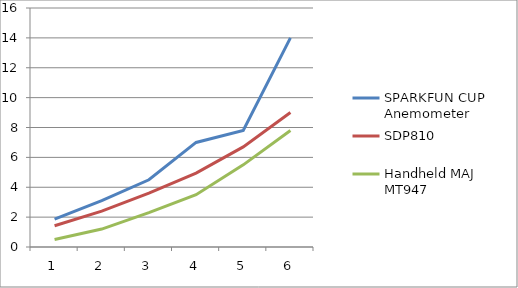
| Category | SPARKFUN CUP Anemometer | SDP810 | Handheld MAJ MT947 |
|---|---|---|---|
| 1.0 | 1.86 | 1.42 | 0.5 |
| 2.0 | 3.1 | 2.4 | 1.2 |
| 3.0 | 4.5 | 3.6 | 2.3 |
| 4.0 | 7 | 4.95 | 3.5 |
| 5.0 | 7.8 | 6.7 | 5.5 |
| 6.0 | 14 | 9 | 7.8 |